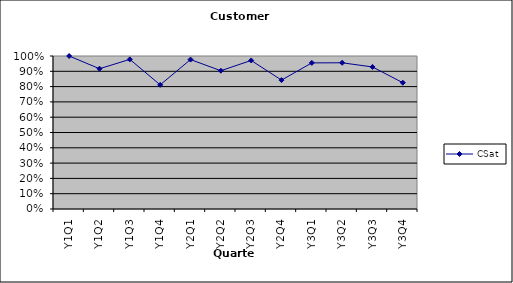
| Category | CSat |
|---|---|
| Y1Q1 | 1 |
| Y1Q2 | 0.917 |
| Y1Q3 | 0.978 |
| Y1Q4 | 0.811 |
| Y2Q1 | 0.977 |
| Y2Q2 | 0.904 |
| Y2Q3 | 0.971 |
| Y2Q4 | 0.842 |
| Y3Q1 | 0.955 |
| Y3Q2 | 0.956 |
| Y3Q3 | 0.928 |
| Y3Q4 | 0.825 |